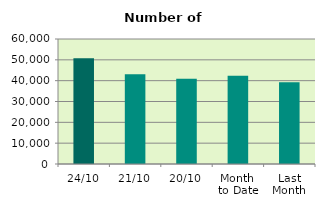
| Category | Series 0 |
|---|---|
| 24/10 | 50766 |
| 21/10 | 43044 |
| 20/10 | 40958 |
| Month 
to Date | 42407.375 |
| Last
Month | 39229.818 |